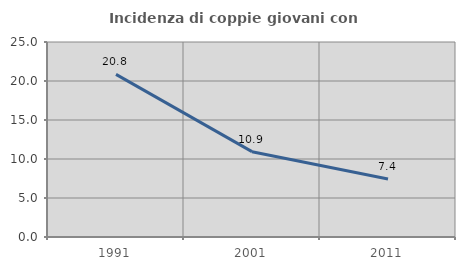
| Category | Incidenza di coppie giovani con figli |
|---|---|
| 1991.0 | 20.849 |
| 2001.0 | 10.94 |
| 2011.0 | 7.433 |